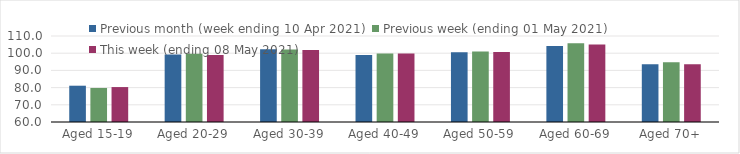
| Category | Previous month (week ending 10 Apr 2021) | Previous week (ending 01 May 2021) | This week (ending 08 May 2021) |
|---|---|---|---|
| Aged 15-19 | 81.1 | 79.79 | 80.31 |
| Aged 20-29 | 99.18 | 99.64 | 98.96 |
| Aged 30-39 | 102.31 | 102.21 | 101.85 |
| Aged 40-49 | 98.92 | 99.84 | 99.84 |
| Aged 50-59 | 100.61 | 101.01 | 100.73 |
| Aged 60-69 | 104.21 | 105.81 | 105.09 |
| Aged 70+ | 93.54 | 94.73 | 93.61 |